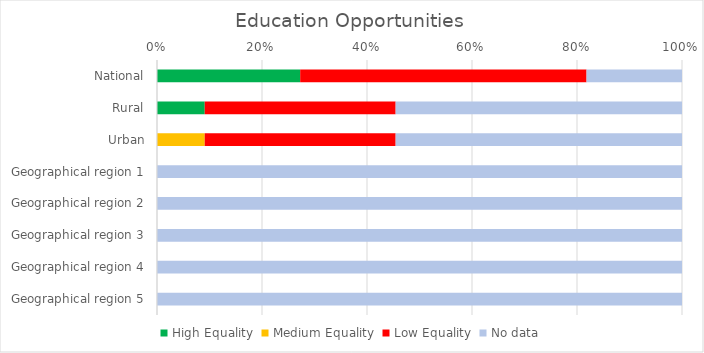
| Category | High Equality | Medium Equality | Low Equality | No data |
|---|---|---|---|---|
| National | 3 | 0 | 6 | 2 |
| Rural | 1 | 0 | 4 | 6 |
| Urban | 0 | 1 | 4 | 6 |
| Geographical region 1 | 0 | 0 | 0 | 11 |
| Geographical region 2 | 0 | 0 | 0 | 11 |
| Geographical region 3 | 0 | 0 | 0 | 11 |
| Geographical region 4 | 0 | 0 | 0 | 11 |
| Geographical region 5 | 0 | 0 | 0 | 11 |